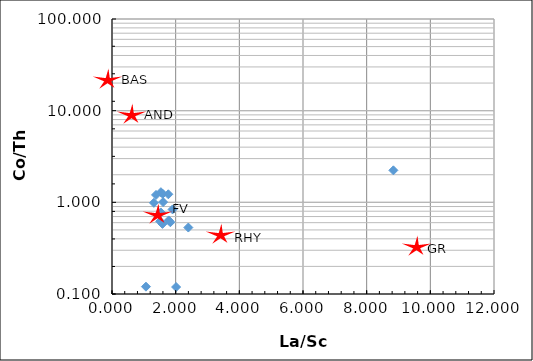
| Category | Series 0 |
|---|---|
| 2.013562603665314 | 0.119 |
| 1.8334549943512528 | 0.606 |
| 1.5940057720889795 | 1.239 |
| 8.839262276390842 | 2.233 |
| 1.5363337032949085 | 1.291 |
| 1.902119830520936 | 0.837 |
| 1.3827979149091616 | 1.204 |
| 1.3160343951504085 | 0.987 |
| 1.58556730480013 | 0.582 |
| 1.6056479867984166 | 1.006 |
| 2.3978450725559357 | 0.531 |
| 1.5324031142715304 | 0.776 |
| 1.7692654242439316 | 1.224 |
| 1.7818885203896437 | 0.635 |
| 1.0665569831676405 | 0.12 |
| 1.5132987349988933 | 0.62 |